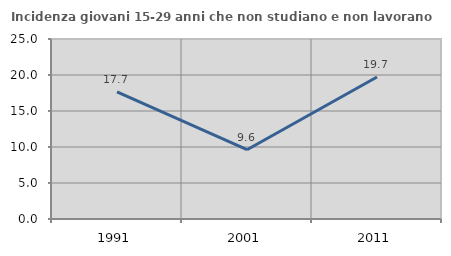
| Category | Incidenza giovani 15-29 anni che non studiano e non lavorano  |
|---|---|
| 1991.0 | 17.659 |
| 2001.0 | 9.621 |
| 2011.0 | 19.721 |